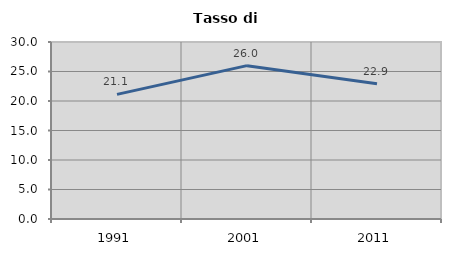
| Category | Tasso di disoccupazione   |
|---|---|
| 1991.0 | 21.121 |
| 2001.0 | 25.991 |
| 2011.0 | 22.917 |